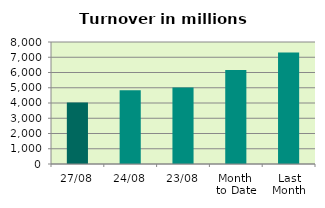
| Category | Series 0 |
|---|---|
| 27/08 | 4035.85 |
| 24/08 | 4832.643 |
| 23/08 | 5023.093 |
| Month 
to Date | 6169.991 |
| Last
Month | 7313.522 |